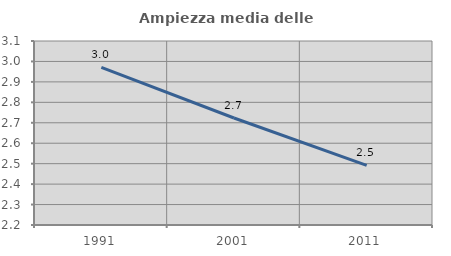
| Category | Ampiezza media delle famiglie |
|---|---|
| 1991.0 | 2.971 |
| 2001.0 | 2.723 |
| 2011.0 | 2.491 |